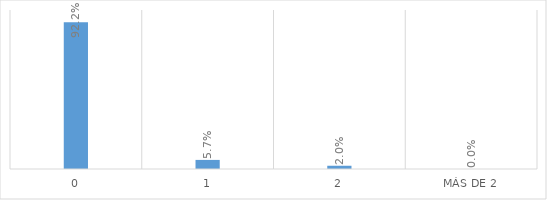
| Category | Series 0 |
|---|---|
| 0 | 0.922 |
| 1 | 0.057 |
| 2 | 0.02 |
| Más de 2 | 0 |